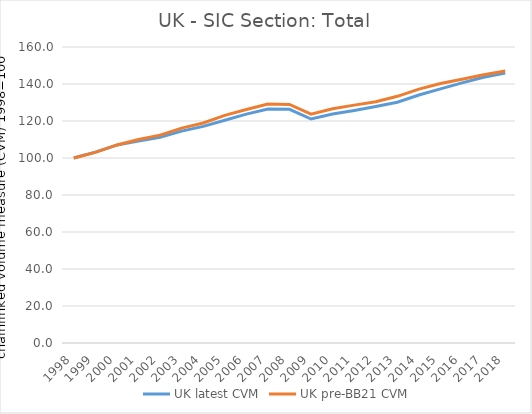
| Category | UK |
|---|---|
| 1998.0 | 100 |
| 1999.0 | 103.043 |
| 2000.0 | 107.052 |
| 2001.0 | 110.003 |
| 2002.0 | 112.362 |
| 2003.0 | 116.17 |
| 2004.0 | 118.909 |
| 2005.0 | 123.039 |
| 2006.0 | 126.24 |
| 2007.0 | 129.146 |
| 2008.0 | 128.957 |
| 2009.0 | 123.74 |
| 2010.0 | 126.639 |
| 2011.0 | 128.577 |
| 2012.0 | 130.412 |
| 2013.0 | 133.338 |
| 2014.0 | 137.209 |
| 2015.0 | 140.234 |
| 2016.0 | 142.544 |
| 2017.0 | 145.032 |
| 2018.0 | 146.981 |